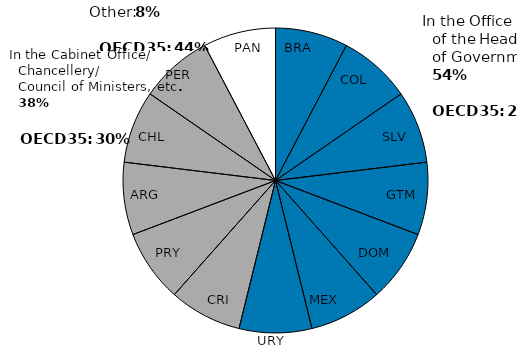
| Category | Series 0 |
|---|---|
| BRA | 1 |
| COL | 1 |
| SLV | 1 |
| GTM | 1 |
| DOM | 1 |
| MEX | 1 |
| URY | 1 |
| CRI | 1 |
| PRY | 1 |
| ARG | 1 |
| CHL | 1 |
| PER | 1 |
| PAN | 1 |